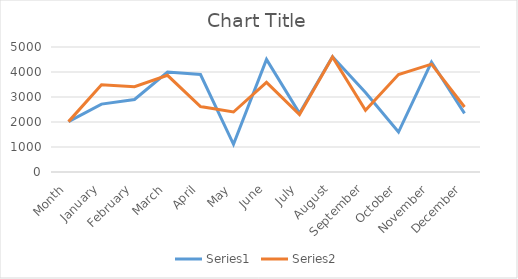
| Category | Series 0 | Series 1 |
|---|---|---|
| Month | 2014 | 2015 |
| January | 2716 | 3489 |
| February | 2900 | 3414 |
| March | 4000 | 3867 |
| April | 3900 | 2616 |
| May | 1109 | 2400 |
| June | 4501 | 3587 |
| July | 2345 | 2301 |
| August | 4613 | 4600 |
| September | 3178 | 2467 |
| October | 1598 | 3898 |
| November | 4400 | 4315 |
| December | 2345 | 2600 |